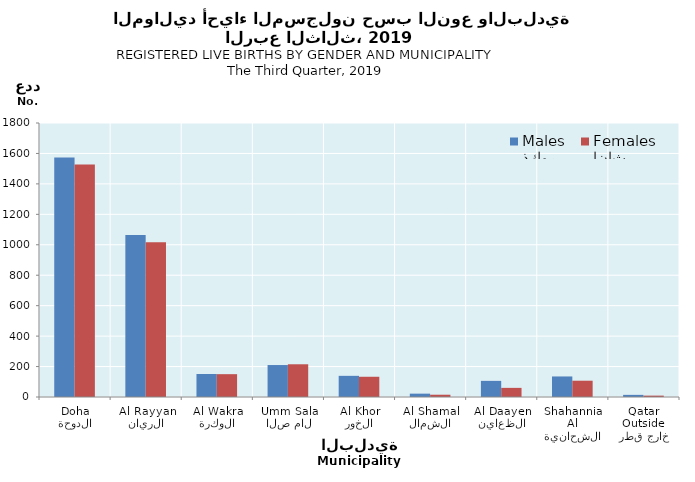
| Category | ذكور
Males | إناث
Females |
|---|---|---|
| الدوحة
Doha | 1574 | 1527 |
| الريان
Al Rayyan | 1064 | 1016 |
| الوكرة
Al Wakra | 151 | 150 |
| ام صلال
Umm Salal | 210 | 215 |
| الخور
Al Khor | 139 | 133 |
| الشمال
Al Shamal | 22 | 15 |
| الظعاين
Al Daayen | 106 | 60 |
| الشحانية
Al Shahannia | 135 | 107 |
| خارج قطر
Outside Qatar | 14 | 9 |